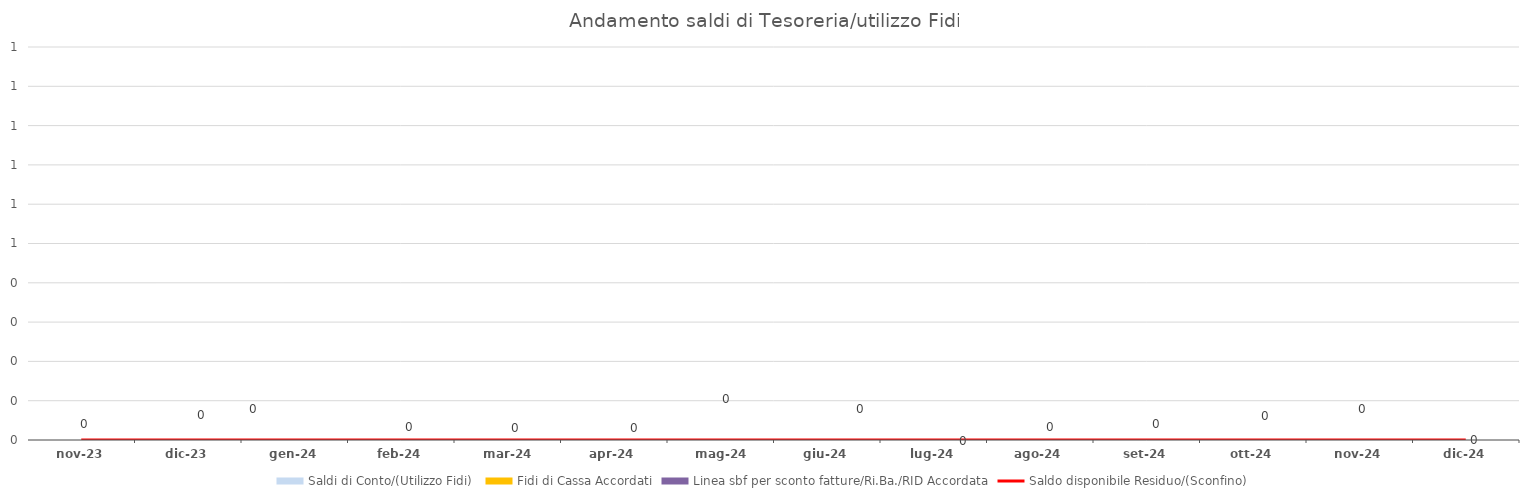
| Category | Saldi di Conto/(Utilizzo Fidi)  | Fidi di Cassa Accordati | Linea sbf per sconto fatture/Ri.Ba./RID Accordata |
|---|---|---|---|
| 2023-11-30 | 0 | 0 | 0 |
| 2023-12-31 | 0 | 0 | 0 |
| 2024-01-31 | 0 | 0 | 0 |
| 2024-02-29 | 0 | 0 | 0 |
| 2024-03-31 | 0 | 0 | 0 |
| 2024-04-30 | 0 | 0 | 0 |
| 2024-05-31 | 0 | 0 | 0 |
| 2024-06-30 | 0 | 0 | 0 |
| 2024-07-31 | 0 | 0 | 0 |
| 2024-08-31 | 0 | 0 | 0 |
| 2024-09-30 | 0 | 0 | 0 |
| 2024-10-31 | 0 | 0 | 0 |
| 2024-11-30 | 0 | 0 | 0 |
| 2024-12-31 | 0 | 0 | 0 |